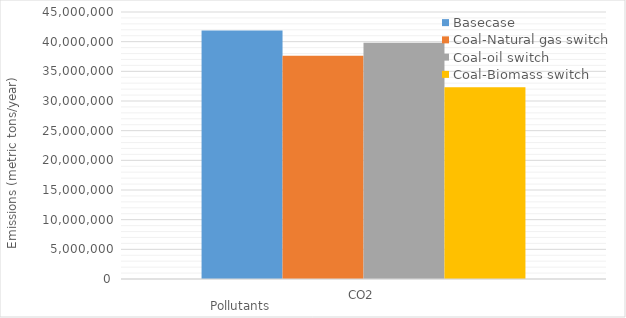
| Category | Basecase | Coal-Natural gas switch | Coal-oil switch | Coal-Biomass switch |
|---|---|---|---|---|
| CO2 | 41872183.695 | 37622997.097 | 39810673.559 | 32334361 |